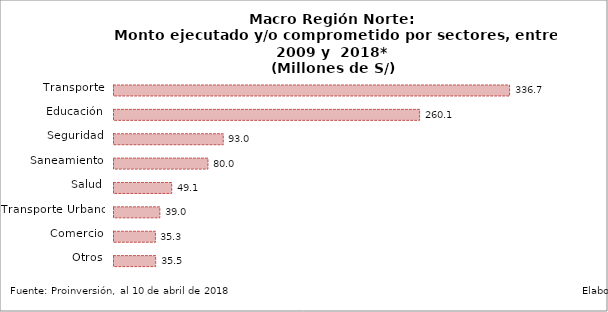
| Category | Series 0 | Series 1 |
|---|---|---|
| Transporte |  | 336.669 |
| Educación |  | 260.089 |
| Seguridad |  | 92.995 |
| Saneamiento |  | 79.954 |
| Salud |  | 49.089 |
| Transporte Urbano |  | 38.999 |
| Comercio |  | 35.259 |
| Otros |  | 35.459 |